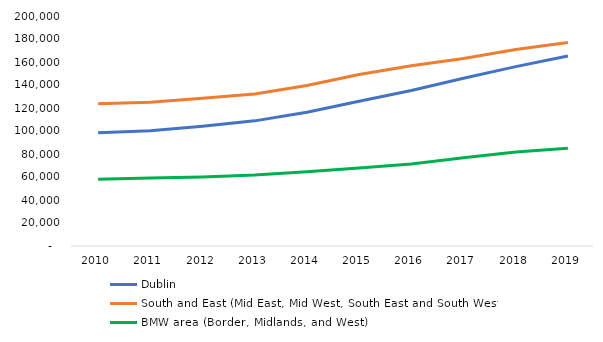
| Category | Dublin | South and East (Mid East, Mid West, South East and South West) | BMW area (Border, Midlands, and West) |
|---|---|---|---|
| 2010.0 | 98506 | 123754 | 57951 |
| 2011.0 | 100227 | 124981 | 59032 |
| 2012.0 | 104210 | 128536 | 59913 |
| 2013.0 | 108816 | 132148 | 61636 |
| 2014.0 | 116372 | 139509 | 64552 |
| 2015.0 | 125827 | 149050 | 67820 |
| 2016.0 | 135195 | 156789 | 71406 |
| 2017.0 | 145851 | 163016 | 76723 |
| 2018.0 | 155965 | 170885 | 81668 |
| 2019.0 | 165241 | 176864 | 85046 |